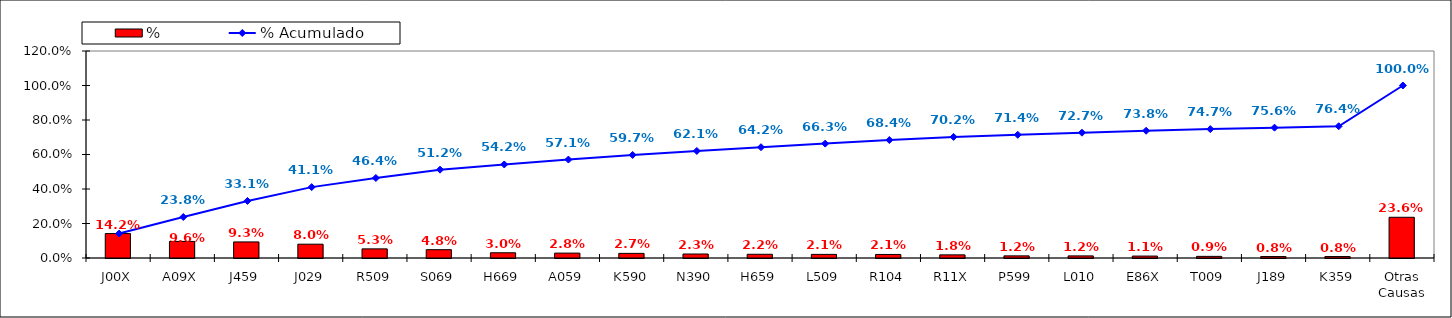
| Category | % |
|---|---|
| J00X | 0.142 |
| A09X | 0.096 |
| J459 | 0.093 |
| J029 | 0.08 |
| R509 | 0.053 |
| S069 | 0.048 |
| H669 | 0.03 |
| A059 | 0.028 |
| K590 | 0.027 |
| N390 | 0.023 |
| H659 | 0.022 |
| L509 | 0.021 |
| R104 | 0.021 |
| R11X | 0.018 |
| P599 | 0.012 |
| L010 | 0.012 |
| E86X | 0.011 |
| T009 | 0.009 |
| J189 | 0.008 |
| K359 | 0.008 |
| Otras Causas | 0.236 |